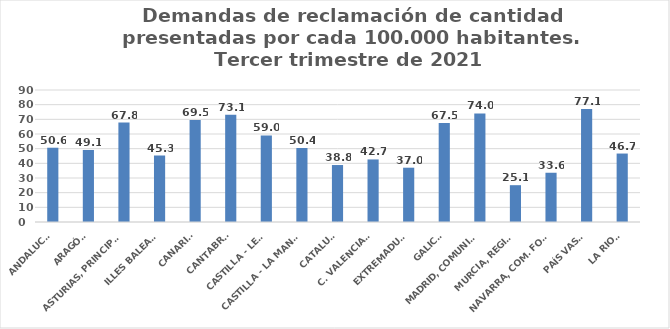
| Category | Series 0 |
|---|---|
| ANDALUCÍA | 50.643 |
| ARAGÓN | 49.118 |
| ASTURIAS, PRINCIPADO | 67.816 |
| ILLES BALEARS | 45.294 |
| CANARIAS | 69.542 |
| CANTABRIA | 73.078 |
| CASTILLA - LEÓN | 59.044 |
| CASTILLA - LA MANCHA | 50.445 |
| CATALUÑA | 38.843 |
| C. VALENCIANA | 42.658 |
| EXTREMADURA | 37.024 |
| GALICIA | 67.477 |
| MADRID, COMUNIDAD | 74.048 |
| MURCIA, REGIÓN | 25.1 |
| NAVARRA, COM. FORAL | 33.584 |
| PAÍS VASCO | 77.105 |
| LA RIOJA | 46.676 |